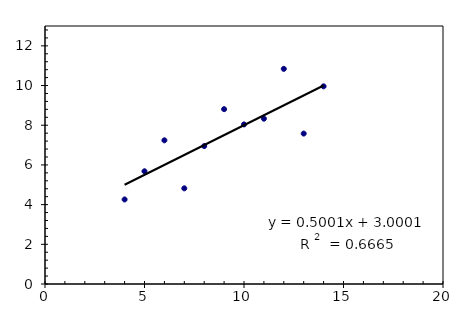
| Category | Series 0 |
|---|---|
| 4.0 | 4.26 |
| 5.0 | 5.68 |
| 6.0 | 7.24 |
| 7.0 | 4.82 |
| 8.0 | 6.95 |
| 9.0 | 8.81 |
| 10.0 | 8.04 |
| 11.0 | 8.33 |
| 12.0 | 10.84 |
| 13.0 | 7.58 |
| 14.0 | 9.96 |